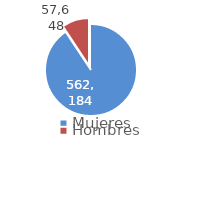
| Category | Series 0 |
|---|---|
| Mujeres | 562184 |
| Hombres | 57648 |